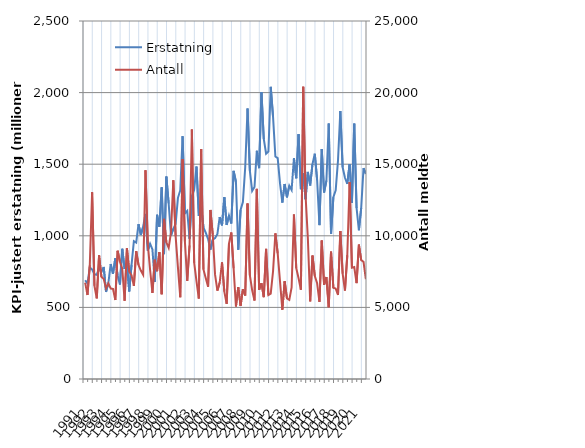
| Category | Erstatning |
|---|---|
| 1991.0 | 689.374 |
| nan | 666.894 |
| nan | 778.133 |
| nan | 764.907 |
| 1992.0 | 731.882 |
| nan | 727.208 |
| nan | 776.459 |
| nan | 745.324 |
| 1993.0 | 782.622 |
| nan | 607.8 |
| nan | 670.591 |
| nan | 802.547 |
| 1994.0 | 734.838 |
| nan | 842.978 |
| nan | 722.495 |
| nan | 659.654 |
| 1995.0 | 909.176 |
| nan | 768.464 |
| nan | 810.842 |
| nan | 611.488 |
| 1996.0 | 796.7 |
| nan | 962.483 |
| nan | 952.884 |
| nan | 1081.216 |
| 1997.0 | 1005.654 |
| nan | 1063.482 |
| nan | 1152.959 |
| nan | 896.353 |
| 1998.0 | 944.295 |
| nan | 904.9 |
| nan | 678.191 |
| nan | 1147.03 |
| 1999.0 | 1062.77 |
| nan | 1338.301 |
| nan | 871.881 |
| nan | 1413.509 |
| 2000.0 | 1225.813 |
| nan | 1003.185 |
| nan | 1048.804 |
| nan | 1082.395 |
| 2001.0 | 1265.218 |
| nan | 1317.001 |
| nan | 1695.786 |
| nan | 1155.695 |
| 2002.0 | 1173.818 |
| nan | 979.681 |
| nan | 1278.333 |
| nan | 1322.228 |
| 2003.0 | 1483.611 |
| nan | 1138.839 |
| nan | 1202.166 |
| nan | 1058.724 |
| 2004.0 | 1021.086 |
| nan | 976.786 |
| nan | 903.296 |
| nan | 973.154 |
| 2005.0 | 983.699 |
| nan | 1012.023 |
| nan | 1130.564 |
| nan | 1072.855 |
| 2006.0 | 1270.393 |
| nan | 1075.992 |
| nan | 1141.091 |
| nan | 1085.496 |
| 2007.0 | 1453.648 |
| nan | 1377.06 |
| nan | 902.201 |
| nan | 1180.267 |
| 2008.0 | 1236.198 |
| nan | 1478.992 |
| nan | 1888.435 |
| nan | 1454.744 |
| 2009.0 | 1313.509 |
| nan | 1341.029 |
| nan | 1593.905 |
| nan | 1472.687 |
| 2010.0 | 2003.113 |
| nan | 1676.316 |
| nan | 1573.884 |
| nan | 1589.066 |
| 2011.0 | 2040.332 |
| nan | 1830.54 |
| nan | 1553.457 |
| nan | 1542.115 |
| 2012.0 | 1365.922 |
| nan | 1232.315 |
| nan | 1361.826 |
| nan | 1268.865 |
| 2013.0 | 1350.066 |
| nan | 1320.139 |
| nan | 1542.162 |
| nan | 1401.643 |
| 2014.0 | 1710.003 |
| nan | 1325.632 |
| nan | 1438.142 |
| nan | 1255.22 |
| 2015.0 | 1446.15 |
| nan | 1351.835 |
| nan | 1501.279 |
| nan | 1573.052 |
| 2016.0 | 1388.7 |
| nan | 1074.557 |
| nan | 1606.313 |
| nan | 1302.798 |
| 2017.0 | 1384.869 |
| nan | 1784.337 |
| nan | 1012.84 |
| nan | 1269.838 |
| 2018.0 | 1318.356 |
| nan | 1526.482 |
| nan | 1871.334 |
| nan | 1478.409 |
| 2019.0 | 1405.033 |
| nan | 1362.292 |
| nan | 1501.153 |
| nan | 1229.981 |
| 2020.0 | 1783.259 |
| nan | 1194.46 |
| nan | 1038.756 |
| nan | 1194.231 |
| 2021.0 | 1472.531 |
| nan | 1432.586 |